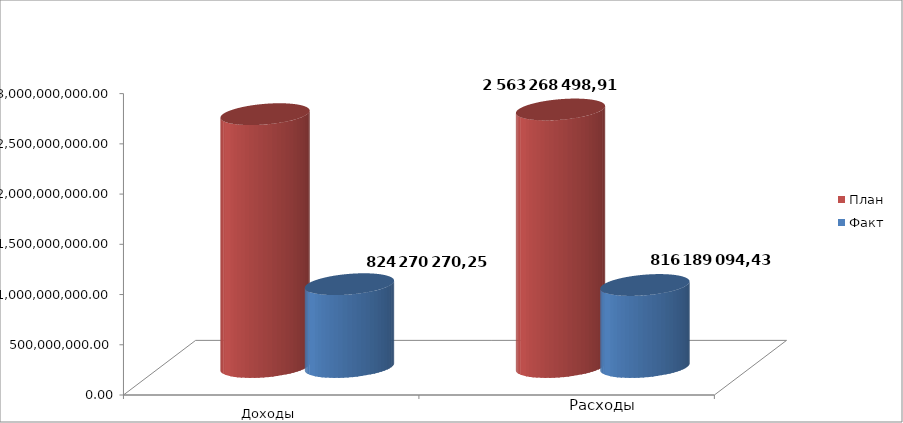
| Category | План | Факт |
|---|---|---|
| 0 | 2516777080.96 | 824270270.25 |
| 1 | 2563268498.91 | 816189094.43 |